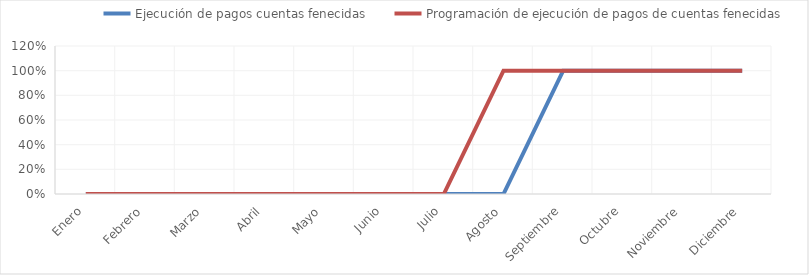
| Category | Ejecución de pagos cuentas fenecidas | Programación de ejecución de pagos de cuentas fenecidas |
|---|---|---|
| 0 | 0 | 0 |
| 1 | 0 | 0 |
| 2 | 0 | 0 |
| 3 | 0 | 0 |
| 4 | 0 | 0 |
| 5 | 0 | 0 |
| 6 | 0 | 0 |
| 7 | 0 | 1 |
| 8 | 1 | 1 |
| 9 | 1 | 1 |
| 10 | 1 | 1 |
| 11 | 1 | 1 |